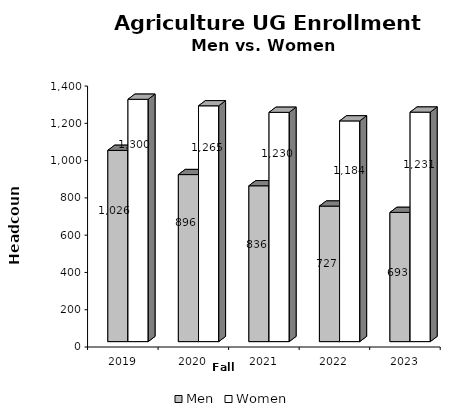
| Category | Men | Women |
|---|---|---|
| 2019.0 | 1026 | 1300 |
| 2020.0 | 896 | 1265 |
| 2021.0 | 836 | 1230 |
| 2022.0 | 727 | 1184 |
| 2023.0 | 693 | 1231 |